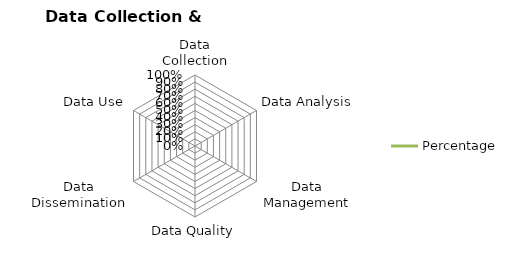
| Category | Percentage |
|---|---|
| Data Collection | 0 |
| Data Analysis | 0 |
| Data Management | 0 |
| Data Quality | 0 |
| Data Dissemination | 0 |
| Data Use | 0 |